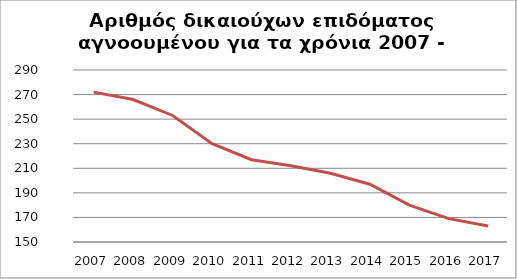
| Category | Series 1 |
|---|---|
| 2007.0 | 272 |
| 2008.0 | 266 |
| 2009.0 | 253 |
| 2010.0 | 230 |
| 2011.0 | 217 |
| 2012.0 | 212 |
| 2013.0 | 206 |
| 2014.0 | 197 |
| 2015.0 | 180 |
| 2016.0 | 169 |
| 2017.0 | 163 |